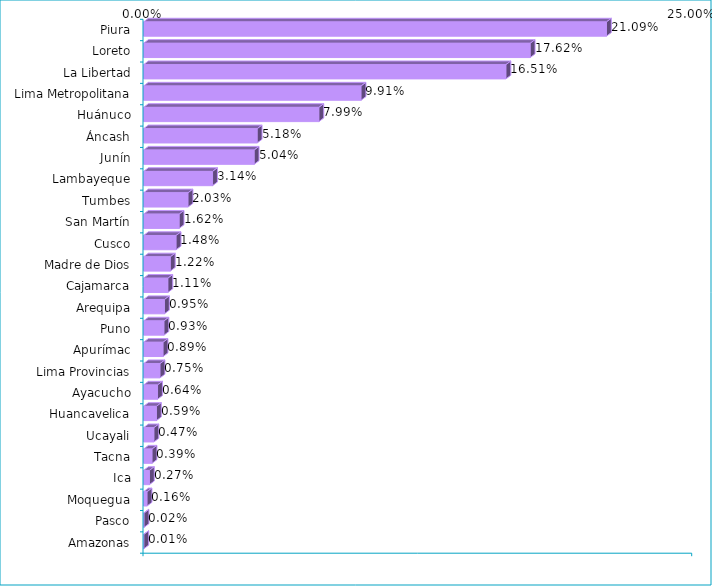
| Category | Series 0 |
|---|---|
| Piura | 0.211 |
| Loreto | 0.176 |
| La Libertad | 0.165 |
| Lima Metropolitana | 0.099 |
| Huánuco | 0.08 |
| Áncash | 0.052 |
| Junín | 0.05 |
| Lambayeque | 0.031 |
| Tumbes | 0.02 |
| San Martín | 0.016 |
| Cusco | 0.015 |
| Madre de Dios | 0.012 |
| Cajamarca | 0.011 |
| Arequipa | 0.01 |
| Puno | 0.009 |
| Apurímac | 0.009 |
| Lima Provincias | 0.008 |
| Ayacucho | 0.006 |
| Huancavelica | 0.006 |
| Ucayali | 0.005 |
| Tacna | 0.004 |
| Ica | 0.003 |
| Moquegua | 0.002 |
| Pasco | 0 |
| Amazonas | 0 |